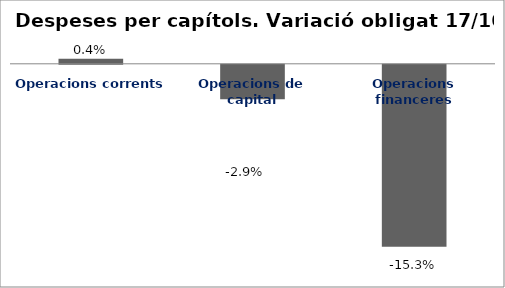
| Category | Series 0 |
|---|---|
| Operacions corrents | 0.004 |
| Operacions de capital | -0.029 |
| Operacions financeres | -0.153 |